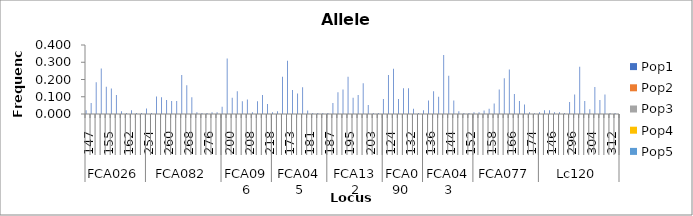
| Category | Pop1 | Pop2 | Pop3 | Pop4 | Pop5 |
|---|---|---|---|---|---|
| 0 | 0.021 | 0 | 0 | 0 | 0 |
| 1 | 0.063 | 0 | 0 | 0 | 0 |
| 2 | 0.184 | 0 | 0 | 0 | 0 |
| 3 | 0.263 | 0 | 0 | 0 | 0 |
| 4 | 0.158 | 0 | 0 | 0 | 0 |
| 5 | 0.147 | 0 | 0 | 0 | 0 |
| 6 | 0.111 | 0 | 0 | 0 | 0 |
| 7 | 0.016 | 0 | 0 | 0 | 0 |
| 8 | 0.005 | 0 | 0 | 0 | 0 |
| 9 | 0.021 | 0 | 0 | 0 | 0 |
| 10 | 0.005 | 0 | 0 | 0 | 0 |
| 11 | 0.005 | 0 | 0 | 0 | 0 |
| 12 | 0.032 | 0 | 0 | 0 | 0 |
| 13 | 0.005 | 0 | 0 | 0 | 0 |
| 14 | 0.102 | 0 | 0 | 0 | 0 |
| 15 | 0.097 | 0 | 0 | 0 | 0 |
| 16 | 0.081 | 0 | 0 | 0 | 0 |
| 17 | 0.075 | 0 | 0 | 0 | 0 |
| 18 | 0.075 | 0 | 0 | 0 | 0 |
| 19 | 0.226 | 0 | 0 | 0 | 0 |
| 20 | 0.167 | 0 | 0 | 0 | 0 |
| 21 | 0.097 | 0 | 0 | 0 | 0 |
| 22 | 0.011 | 0 | 0 | 0 | 0 |
| 23 | 0.005 | 0 | 0 | 0 | 0 |
| 24 | 0.005 | 0 | 0 | 0 | 0 |
| 25 | 0.011 | 0 | 0 | 0 | 0 |
| 26 | 0.011 | 0 | 0 | 0 | 0 |
| 27 | 0.042 | 0 | 0 | 0 | 0 |
| 28 | 0.321 | 0 | 0 | 0 | 0 |
| 29 | 0.095 | 0 | 0 | 0 | 0 |
| 30 | 0.132 | 0 | 0 | 0 | 0 |
| 31 | 0.074 | 0 | 0 | 0 | 0 |
| 32 | 0.084 | 0 | 0 | 0 | 0 |
| 33 | 0.011 | 0 | 0 | 0 | 0 |
| 34 | 0.074 | 0 | 0 | 0 | 0 |
| 35 | 0.111 | 0 | 0 | 0 | 0 |
| 36 | 0.058 | 0 | 0 | 0 | 0 |
| 37 | 0.01 | 0 | 0 | 0 | 0 |
| 38 | 0.015 | 0 | 0 | 0 | 0 |
| 39 | 0.216 | 0 | 0 | 0 | 0 |
| 40 | 0.309 | 0 | 0 | 0 | 0 |
| 41 | 0.139 | 0 | 0 | 0 | 0 |
| 42 | 0.119 | 0 | 0 | 0 | 0 |
| 43 | 0.155 | 0 | 0 | 0 | 0 |
| 44 | 0.021 | 0 | 0 | 0 | 0 |
| 45 | 0.005 | 0 | 0 | 0 | 0 |
| 46 | 0.005 | 0 | 0 | 0 | 0 |
| 47 | 0.005 | 0 | 0 | 0 | 0 |
| 48 | 0.005 | 0 | 0 | 0 | 0 |
| 49 | 0.063 | 0 | 0 | 0 | 0 |
| 50 | 0.126 | 0 | 0 | 0 | 0 |
| 51 | 0.142 | 0 | 0 | 0 | 0 |
| 52 | 0.216 | 0 | 0 | 0 | 0 |
| 53 | 0.095 | 0 | 0 | 0 | 0 |
| 54 | 0.111 | 0 | 0 | 0 | 0 |
| 55 | 0.179 | 0 | 0 | 0 | 0 |
| 56 | 0.053 | 0 | 0 | 0 | 0 |
| 57 | 0.005 | 0 | 0 | 0 | 0 |
| 58 | 0.005 | 0 | 0 | 0 | 0 |
| 59 | 0.088 | 0 | 0 | 0 | 0 |
| 60 | 0.227 | 0 | 0 | 0 | 0 |
| 61 | 0.263 | 0 | 0 | 0 | 0 |
| 62 | 0.088 | 0 | 0 | 0 | 0 |
| 63 | 0.149 | 0 | 0 | 0 | 0 |
| 64 | 0.149 | 0 | 0 | 0 | 0 |
| 65 | 0.031 | 0 | 0 | 0 | 0 |
| 66 | 0.005 | 0 | 0 | 0 | 0 |
| 67 | 0.021 | 0 | 0 | 0 | 0 |
| 68 | 0.079 | 0 | 0 | 0 | 0 |
| 69 | 0.132 | 0 | 0 | 0 | 0 |
| 70 | 0.1 | 0 | 0 | 0 | 0 |
| 71 | 0.342 | 0 | 0 | 0 | 0 |
| 72 | 0.221 | 0 | 0 | 0 | 0 |
| 73 | 0.079 | 0 | 0 | 0 | 0 |
| 74 | 0.016 | 0 | 0 | 0 | 0 |
| 75 | 0.005 | 0 | 0 | 0 | 0 |
| 76 | 0.005 | 0 | 0 | 0 | 0 |
| 77 | 0.01 | 0 | 0 | 0 | 0 |
| 78 | 0.01 | 0 | 0 | 0 | 0 |
| 79 | 0.02 | 0 | 0 | 0 | 0 |
| 80 | 0.03 | 0 | 0 | 0 | 0 |
| 81 | 0.061 | 0 | 0 | 0 | 0 |
| 82 | 0.141 | 0 | 0 | 0 | 0 |
| 83 | 0.207 | 0 | 0 | 0 | 0 |
| 84 | 0.258 | 0 | 0 | 0 | 0 |
| 85 | 0.116 | 0 | 0 | 0 | 0 |
| 86 | 0.076 | 0 | 0 | 0 | 0 |
| 87 | 0.056 | 0 | 0 | 0 | 0 |
| 88 | 0.01 | 0 | 0 | 0 | 0 |
| 89 | 0.005 | 0 | 0 | 0 | 0 |
| 90 | 0.011 | 0 | 0 | 0 | 0 |
| 91 | 0.022 | 0 | 0 | 0 | 0 |
| 92 | 0.022 | 0 | 0 | 0 | 0 |
| 93 | 0.011 | 0 | 0 | 0 | 0 |
| 94 | 0.011 | 0 | 0 | 0 | 0 |
| 95 | 0.005 | 0 | 0 | 0 | 0 |
| 96 | 0.07 | 0 | 0 | 0 | 0 |
| 97 | 0.113 | 0 | 0 | 0 | 0 |
| 98 | 0.274 | 0 | 0 | 0 | 0 |
| 99 | 0.075 | 0 | 0 | 0 | 0 |
| 100 | 0.027 | 0 | 0 | 0 | 0 |
| 101 | 0.156 | 0 | 0 | 0 | 0 |
| 102 | 0.081 | 0 | 0 | 0 | 0 |
| 103 | 0.113 | 0 | 0 | 0 | 0 |
| 104 | 0.005 | 0 | 0 | 0 | 0 |
| 105 | 0.005 | 0 | 0 | 0 | 0 |